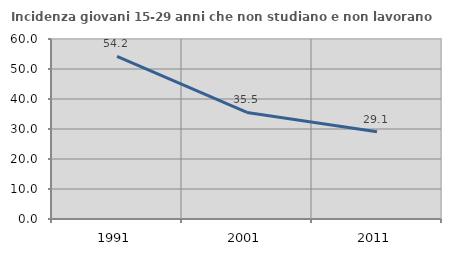
| Category | Incidenza giovani 15-29 anni che non studiano e non lavorano  |
|---|---|
| 1991.0 | 54.206 |
| 2001.0 | 35.507 |
| 2011.0 | 29.091 |